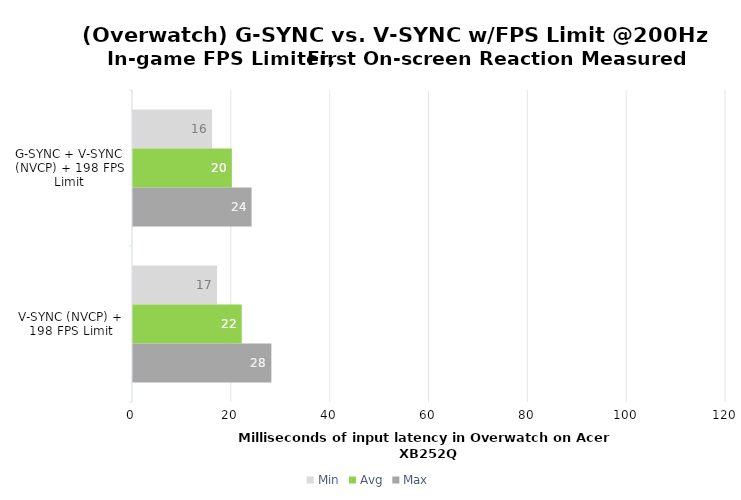
| Category | Min | Avg | Max |
|---|---|---|---|
| G-SYNC + V-SYNC (NVCP) + 198 FPS Limit | 16 | 20 | 24 |
| V-SYNC (NVCP) + 198 FPS Limit | 17 | 22 | 28 |